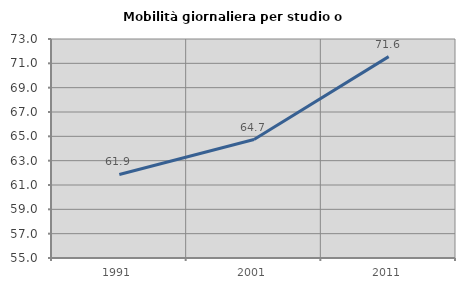
| Category | Mobilità giornaliera per studio o lavoro |
|---|---|
| 1991.0 | 61.866 |
| 2001.0 | 64.737 |
| 2011.0 | 71.55 |